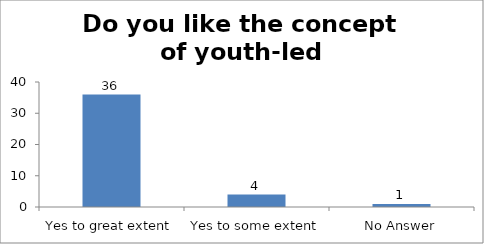
| Category | Do you like the concept of youth-led changemaking?  |
|---|---|
| Yes to great extent | 36 |
| Yes to some extent | 4 |
| No Answer | 1 |